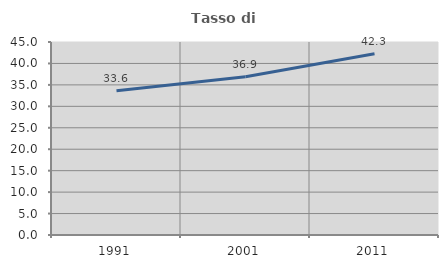
| Category | Tasso di occupazione   |
|---|---|
| 1991.0 | 33.622 |
| 2001.0 | 36.903 |
| 2011.0 | 42.283 |